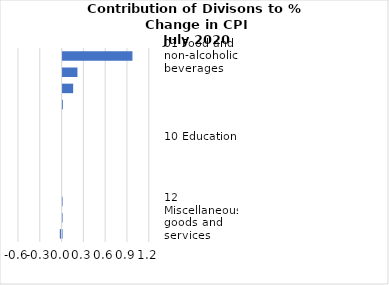
| Category |     Contributions |
|---|---|
| 01 Food and non-alcoholic beverages | 0.962 |
| 02 Alcoholic beverages, tobacco and narcotics | 0.204 |
| 07 Transport | 0.146 |
| 04 Housing, water, electricity, gas and other fuels | 0.004 |
| 11 Restaurants and hotels | 0 |
| 10 Education | 0 |
| 08 Communication | 0 |
| 09 Recreation and culture | 0 |
| 06 Health | 0 |
| 03 Clothing and footwear | -0.001 |
| 12 Miscellaneous goods and services | -0.002 |
| 05 Furnishings, household equipment and routine household maintenance | -0.024 |